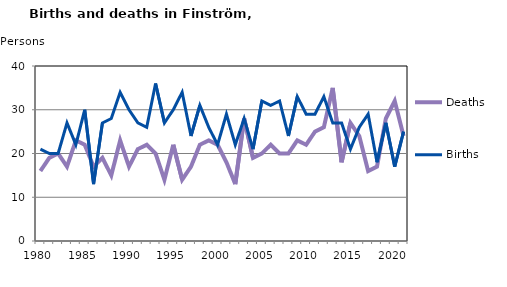
| Category | Deaths | Births |
|---|---|---|
| 1980.0 | 16 | 21 |
| 1981.0 | 19 | 20 |
| 1982.0 | 20 | 20 |
| 1983.0 | 17 | 27 |
| 1984.0 | 23 | 22 |
| 1985.0 | 22 | 30 |
| 1986.0 | 17 | 13 |
| 1987.0 | 19 | 27 |
| 1988.0 | 15 | 28 |
| 1989.0 | 23 | 34 |
| 1990.0 | 17 | 30 |
| 1991.0 | 21 | 27 |
| 1992.0 | 22 | 26 |
| 1993.0 | 20 | 36 |
| 1994.0 | 14 | 27 |
| 1995.0 | 22 | 30 |
| 1996.0 | 14 | 34 |
| 1997.0 | 17 | 24 |
| 1998.0 | 22 | 31 |
| 1999.0 | 23 | 26 |
| 2000.0 | 22 | 22 |
| 2001.0 | 18 | 29 |
| 2002.0 | 13 | 22 |
| 2003.0 | 28 | 28 |
| 2004.0 | 19 | 21 |
| 2005.0 | 20 | 32 |
| 2006.0 | 22 | 31 |
| 2007.0 | 20 | 32 |
| 2008.0 | 20 | 24 |
| 2009.0 | 23 | 33 |
| 2010.0 | 22 | 29 |
| 2011.0 | 25 | 29 |
| 2012.0 | 26 | 33 |
| 2013.0 | 35 | 27 |
| 2014.0 | 18 | 27 |
| 2015.0 | 27 | 21 |
| 2016.0 | 24 | 26 |
| 2017.0 | 16 | 29 |
| 2018.0 | 17 | 18 |
| 2019.0 | 28 | 27 |
| 2020.0 | 32 | 17 |
| 2021.0 | 24 | 25 |